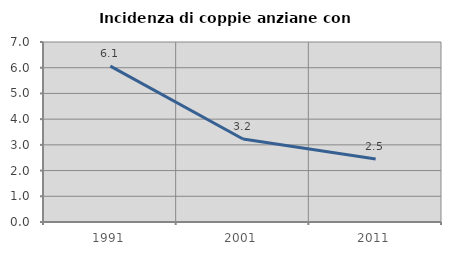
| Category | Incidenza di coppie anziane con figli |
|---|---|
| 1991.0 | 6.061 |
| 2001.0 | 3.226 |
| 2011.0 | 2.451 |